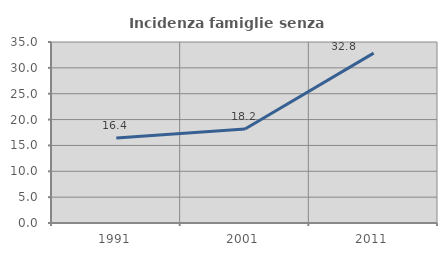
| Category | Incidenza famiglie senza nuclei |
|---|---|
| 1991.0 | 16.434 |
| 2001.0 | 18.191 |
| 2011.0 | 32.847 |